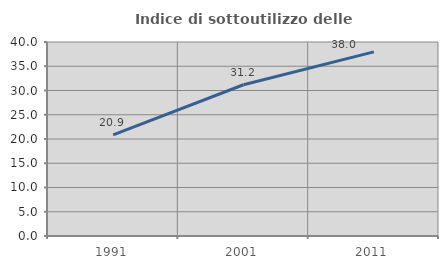
| Category | Indice di sottoutilizzo delle abitazioni  |
|---|---|
| 1991.0 | 20.86 |
| 2001.0 | 31.187 |
| 2011.0 | 37.958 |